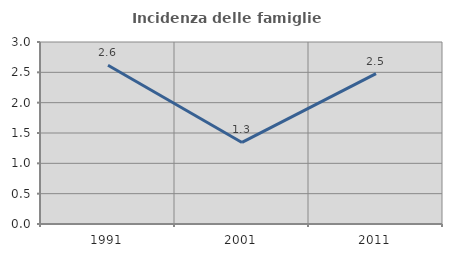
| Category | Incidenza delle famiglie numerose |
|---|---|
| 1991.0 | 2.618 |
| 2001.0 | 1.344 |
| 2011.0 | 2.479 |